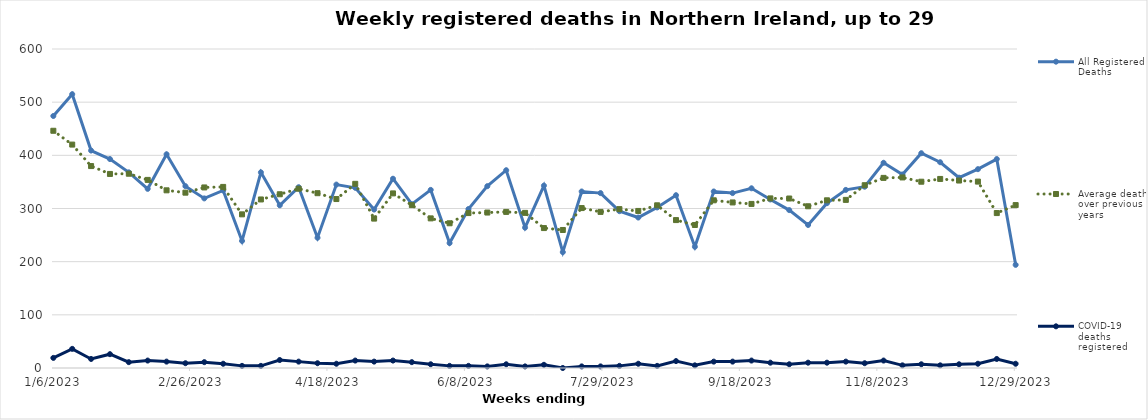
| Category | All Registered Deaths | Average deaths over previous 5 years | COVID-19 deaths registered |
|---|---|---|---|
| 1/6/23 | 474 | 446.2 | 19 |
| 1/13/23 | 515 | 420.2 | 36 |
| 1/20/23 | 409 | 379.8 | 17 |
| 1/27/23 | 393 | 365 | 26 |
| 2/3/23 | 368 | 365.4 | 11 |
| 2/10/23 | 337 | 353.8 | 14 |
| 2/17/23 | 402 | 334.2 | 12 |
| 2/24/23 | 342 | 329.8 | 9 |
| 3/3/23 | 319 | 339.6 | 11 |
| 3/10/23 | 334 | 340.6 | 8 |
| 3/17/23 | 239 | 289 | 4 |
| 3/24/23 | 368 | 317 | 4 |
| 3/31/23 | 306 | 326.8 | 15 |
| 4/7/23 | 340 | 337.2 | 12 |
| 4/14/23 | 245 | 328.8 | 9 |
| 4/21/23 | 345 | 317.8 | 8 |
| 4/28/23 | 339 | 346.4 | 14 |
| 5/5/23 | 298 | 281 | 12 |
| 5/12/23 | 356 | 328.4 | 14 |
| 5/19/23 | 308 | 306.4 | 11 |
| 5/26/23 | 335 | 281.4 | 7 |
| 6/2/23 | 235 | 272.2 | 4 |
| 6/9/23 | 299 | 291.4 | 4 |
| 6/16/23 | 342 | 292.4 | 3 |
| 6/23/23 | 372 | 293.6 | 7 |
| 6/30/23 | 264 | 291.8 | 3 |
| 7/7/23 | 343 | 263.2 | 6 |
| 7/14/23 | 218 | 259.6 | 0 |
| 7/21/23 | 332 | 300.8 | 3 |
| 7/28/23 | 329 | 293.6 | 3 |
| 8/4/23 | 295 | 298.8 | 4 |
| 8/11/23 | 283 | 295.4 | 8 |
| 8/18/23 | 302 | 306 | 4 |
| 8/25/23 | 325 | 278.2 | 13 |
| 9/1/23 | 228 | 269 | 5 |
| 9/8/23 | 332 | 315.4 | 12 |
| 9/15/23 | 329 | 311.4 | 12 |
| 9/22/23 | 338 | 308.6 | 14 |
| 9/29/23 | 317 | 319 | 10 |
| 10/6/23 | 297 | 318.8 | 7 |
| 10/13/23 | 269 | 304.2 | 10 |
| 10/20/23 | 310 | 315.4 | 10 |
| 10/27/23 | 335 | 316.2 | 12 |
| 11/3/23 | 341 | 343.8 | 9 |
| 11/10/23 | 386 | 357.6 | 14 |
| 11/17/23 | 364 | 358.4 | 5 |
| 11/24/23 | 404 | 350.4 | 7 |
| 12/1/23 | 387 | 355.6 | 5 |
| 12/8/23 | 358 | 352.6 | 7 |
| 12/15/23 | 374 | 350.6 | 8 |
| 12/22/23 | 393 | 291.4 | 17 |
| 12/29/23 | 194 | 306.4 | 8 |